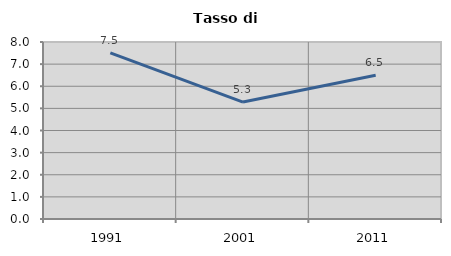
| Category | Tasso di disoccupazione   |
|---|---|
| 1991.0 | 7.511 |
| 2001.0 | 5.285 |
| 2011.0 | 6.501 |